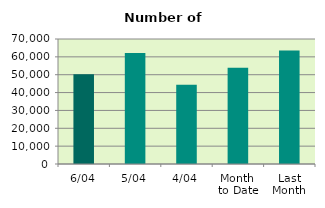
| Category | Series 0 |
|---|---|
| 6/04 | 50254 |
| 5/04 | 62098 |
| 4/04 | 44420 |
| Month 
to Date | 53921.5 |
| Last
Month | 63497.391 |